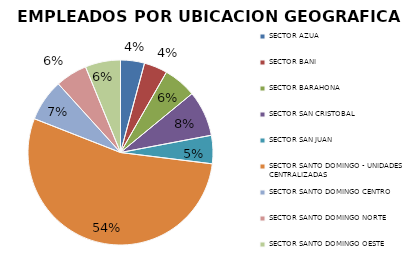
| Category | Series 0 |
|---|---|
| SECTOR AZUA | 126 |
| SECTOR BANI | 123 |
| SECTOR BARAHONA | 174 |
| SECTOR SAN CRISTOBAL | 240 |
| SECTOR SAN JUAN | 149 |
| SECTOR SANTO DOMINGO - UNIDADES CENTRALIZADAS | 1626 |
| SECTOR SANTO DOMINGO CENTRO | 221 |
| SECTOR SANTO DOMINGO NORTE | 167 |
| SECTOR SANTO DOMINGO OESTE | 186 |